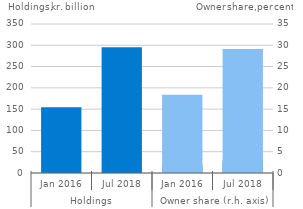
| Category | Series 0 |
|---|---|
| 0 | 154.331 |
| 1 | 295.249 |
| 2 | 18.4 |
| 3 | 29.1 |